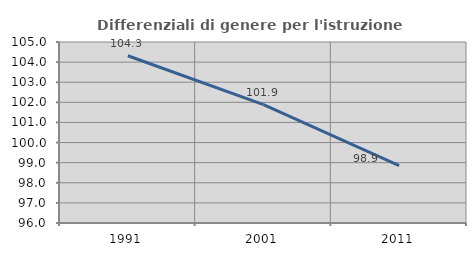
| Category | Differenziali di genere per l'istruzione superiore |
|---|---|
| 1991.0 | 104.315 |
| 2001.0 | 101.883 |
| 2011.0 | 98.855 |